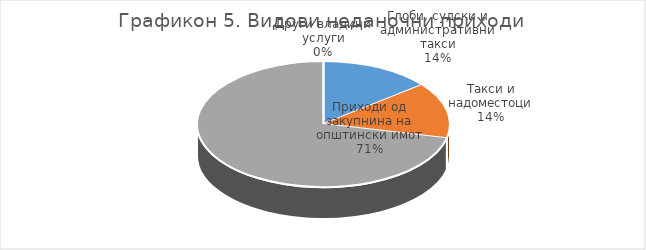
| Category | Структура |
|---|---|
| Глоби, судски и административни такси | 14.286 |
| Такси и надоместоци | 14.286 |
| Приходи од закупнина на општински имот | 71.429 |
| Други владини услуги | 0 |